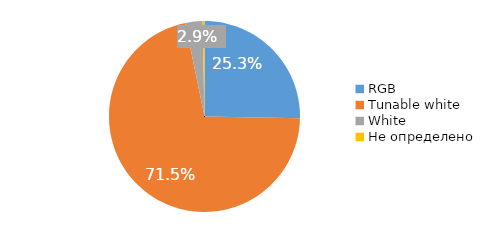
| Category | Series 0 |
|---|---|
| RGB | 0.253 |
| Tunable white | 0.715 |
| White | 0.029 |
| Не определено | 0.003 |